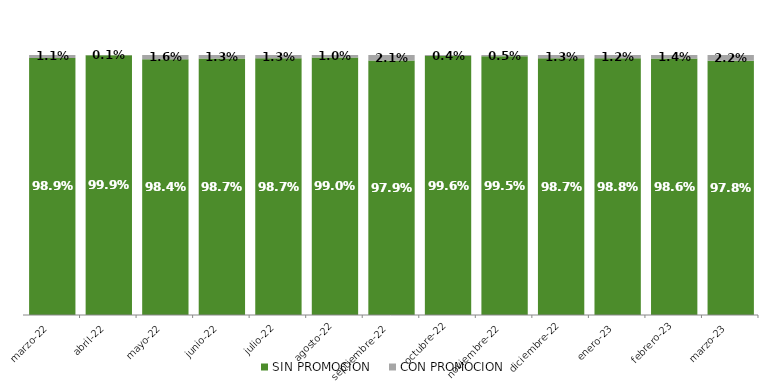
| Category | SIN PROMOCION   | CON PROMOCION   |
|---|---|---|
| 2022-03-01 | 0.989 | 0.011 |
| 2022-04-01 | 0.999 | 0.001 |
| 2022-05-01 | 0.984 | 0.016 |
| 2022-06-01 | 0.987 | 0.013 |
| 2022-07-01 | 0.987 | 0.013 |
| 2022-08-01 | 0.99 | 0.01 |
| 2022-09-01 | 0.979 | 0.021 |
| 2022-10-01 | 0.996 | 0.004 |
| 2022-11-01 | 0.995 | 0.005 |
| 2022-12-01 | 0.987 | 0.013 |
| 2023-01-01 | 0.988 | 0.012 |
| 2023-02-01 | 0.986 | 0.014 |
| 2023-03-01 | 0.978 | 0.022 |